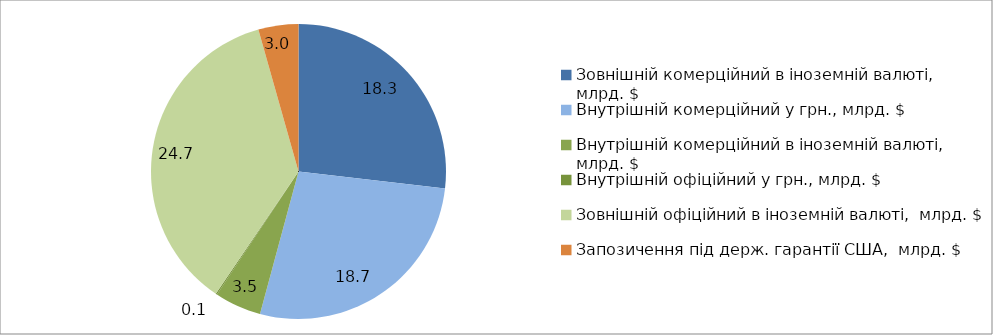
| Category | Series 0 |
|---|---|
| Зовнішній комерційний в іноземній валюті,  млрд. $ | 18.34 |
| Внутрішній комерційний у грн., млрд. $ | 18.71 |
| Внутрішній комерційний в іноземній валюті,  млрд. $ | 3.5 |
| Внутрішній офіційний у грн., млрд. $ | 0.1 |
| Зовнішній офіційний в іноземній валюті,  млрд. $ | 24.7 |
| Запозичення під держ. гарантії США,  млрд. $ | 3 |